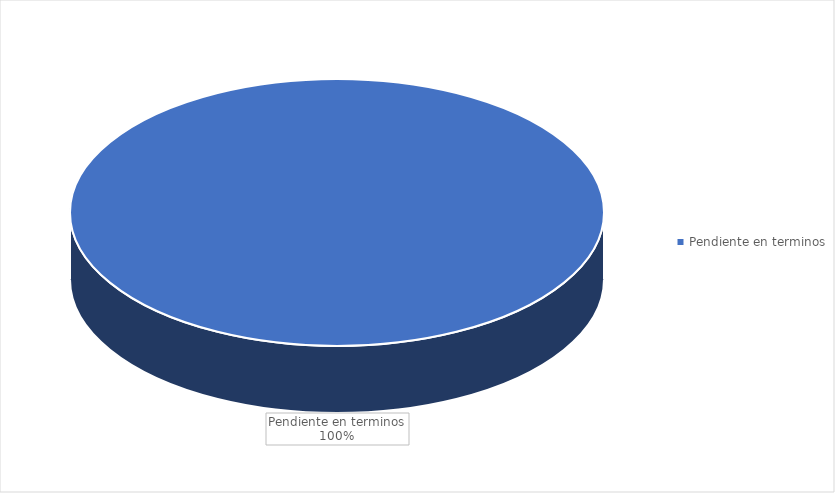
| Category | Total |
|---|---|
| Pendiente en terminos | 8 |